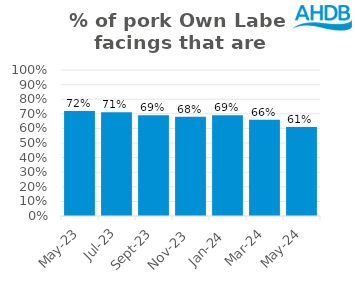
| Category | Pork |
|---|---|
| 2023-05-01 | 0.72 |
| 2023-07-01 | 0.71 |
| 2023-09-01 | 0.69 |
| 2023-11-01 | 0.68 |
| 2024-01-01 | 0.69 |
| 2024-03-01 | 0.66 |
| 2024-05-01 | 0.61 |